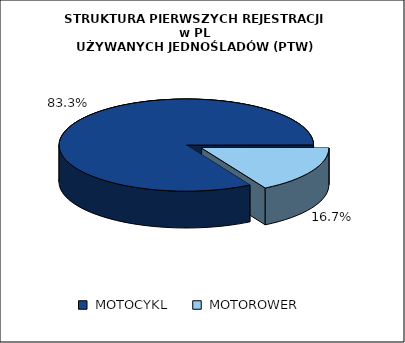
| Category | RAZEM |
|---|---|
|  MOTOCYKL  | 0.833 |
|  MOTOROWER  | 0.167 |